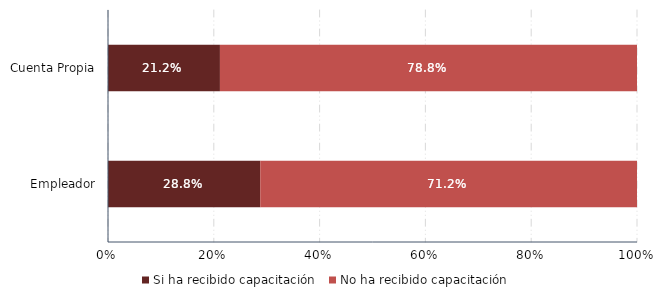
| Category | Si ha recibido capacitación  | No ha recibido capacitación  |
|---|---|---|
| Empleador | 0.288 | 0.712 |
| Cuenta Propia | 0.212 | 0.788 |